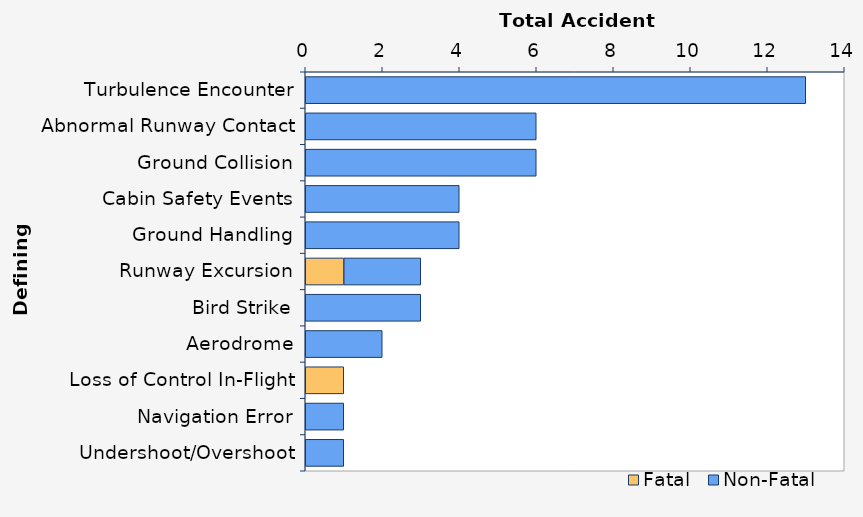
| Category | Fatal | Non-Fatal |
|---|---|---|
| Turbulence Encounter | 0 | 13 |
| Abnormal Runway Contact | 0 | 6 |
| Ground Collision | 0 | 6 |
| Cabin Safety Events | 0 | 4 |
| Ground Handling | 0 | 4 |
| Runway Excursion | 1 | 2 |
| Bird Strike | 0 | 3 |
| Aerodrome | 0 | 2 |
| Loss of Control In-Flight | 1 | 0 |
| Navigation Error | 0 | 1 |
| Undershoot/Overshoot | 0 | 1 |